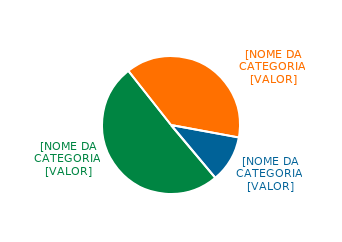
| Category | Series 0 |
|---|---|
| Grupo de controle | 0.505 |
| Investidores não-brasileiros * | 0.385 |
| Investidores brasileiros * | 0.11 |